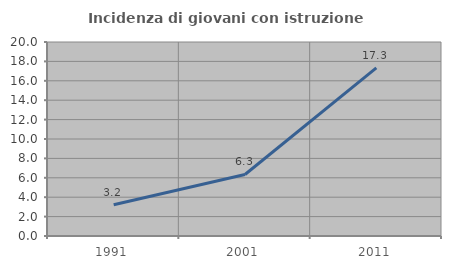
| Category | Incidenza di giovani con istruzione universitaria |
|---|---|
| 1991.0 | 3.219 |
| 2001.0 | 6.343 |
| 2011.0 | 17.333 |